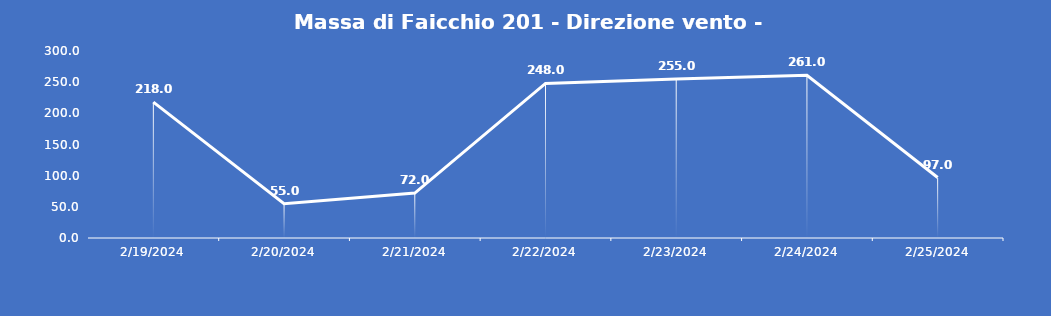
| Category | Massa di Faicchio 201 - Direzione vento - Grezzo (°N) |
|---|---|
| 2/19/24 | 218 |
| 2/20/24 | 55 |
| 2/21/24 | 72 |
| 2/22/24 | 248 |
| 2/23/24 | 255 |
| 2/24/24 | 261 |
| 2/25/24 | 97 |